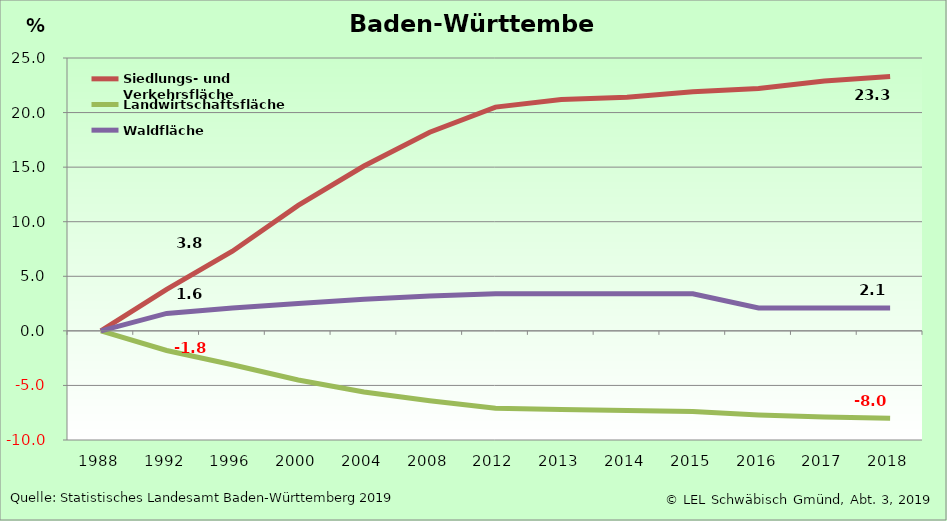
| Category | Siedlungs- und Verkehrsfläche | Landwirtschaftsfläche | Waldfläche |
|---|---|---|---|
| 1988.0 | 0 | 0 | 0 |
| 1992.0 | 3.8 | -1.8 | 1.6 |
| 1996.0 | 7.3 | -3.1 | 2.1 |
| 2000.0 | 11.5 | -4.5 | 2.5 |
| 2004.0 | 15.1 | -5.6 | 2.9 |
| 2008.0 | 18.2 | -6.4 | 3.2 |
| 2012.0 | 20.5 | -7.1 | 3.4 |
| 2013.0 | 21.2 | -7.2 | 3.4 |
| 2014.0 | 21.4 | -7.3 | 3.4 |
| 2015.0 | 21.9 | -7.4 | 3.4 |
| 2016.0 | 22.2 | -7.7 | 2.1 |
| 2017.0 | 22.9 | -7.9 | 2.1 |
| 2018.0 | 23.3 | -8 | 2.1 |